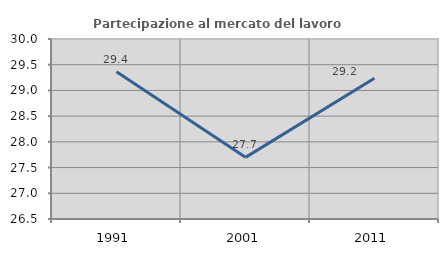
| Category | Partecipazione al mercato del lavoro  femminile |
|---|---|
| 1991.0 | 29.365 |
| 2001.0 | 27.699 |
| 2011.0 | 29.236 |